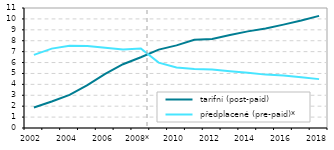
| Category |  tarifní (post-paid) |  předplacené (pre-paid)* |
|---|---|---|
| 2002 | 1.875 | 6.706 |
| 2003 | 2.431 | 7.278 |
| 2004 | 3.04 | 7.544 |
| 2005 | 3.925 | 7.525 |
| 2006 | 4.963 | 7.363 |
| 2007 | 5.848 | 7.207 |
| 2008* | 6.486 | 7.294 |
| 2009 | 7.189 | 5.993 |
| 2010 | 7.575 | 5.538 |
| 2011 | 8.082 | 5.409 |
| 2012 | 8.169 | 5.362 |
| 2013 | 8.524 | 5.195 |
| 2014 | 8.858 | 5.055 |
| 2015 | 9.124 | 4.893 |
| 2016 | 9.478 | 4.821 |
| 2017 | 9.855 | 4.656 |
| 2018 | 10.276 | 4.48 |